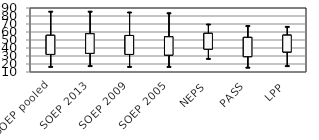
| Category | Series 0 | Series 1 | Series 2 | Series 3 |
|---|---|---|---|---|
| SOEP pooled | 32.03 | 86 | 17 | 55.83 |
| SOEP 2013 | 33.325 | 86 | 18 | 57.801 |
| SOEP 2009 | 31.974 | 85 | 17 | 55.652 |
| SOEP 2005 | 31.14 | 84 | 17 | 54 |
| NEPS | 38.605 | 70 | 27 | 58.299 |
| PASS | 29.206 | 68 | 16 | 53.248 |
| LPP | 35.034 | 67 | 18 | 56 |